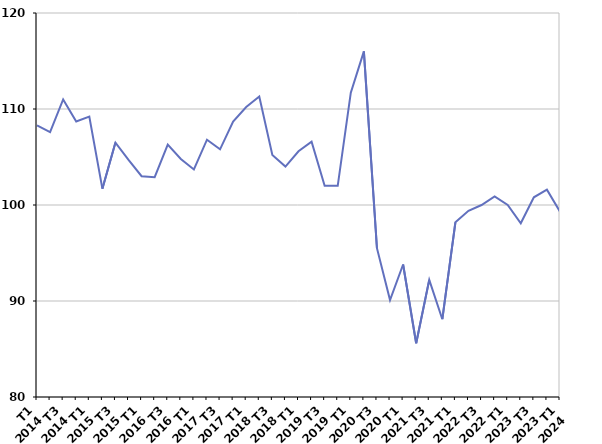
| Category | Fin de contrat |
|---|---|
| T1
2014 | 108.3 |
| T2
2014 | 107.6 |
| T3
2014 | 111 |
| T4
2014 | 108.7 |
| T1
2015 | 109.2 |
| T2
2015 | 101.7 |
| T3
2015 | 106.5 |
| T4
2015 | 104.7 |
| T1
2016 | 103 |
| T2
2016 | 102.9 |
| T3
2016 | 106.3 |
| T4
2016 | 104.8 |
| T1
2017 | 103.7 |
| T2
2017 | 106.8 |
| T3
2017 | 105.8 |
| T4
2017 | 108.7 |
| T1
2018 | 110.2 |
| T2
2018 | 111.3 |
| T3
2018 | 105.2 |
| T4
2018 | 104 |
| T1
2019 | 105.6 |
| T2
2019 | 106.6 |
| T3
2019 | 102 |
| T4
2019 | 102 |
| T1
2020 | 111.7 |
| T2
2020 | 116 |
| T3
2020 | 95.5 |
| T4
2020 | 90.1 |
| T1
2021 | 93.8 |
| T2
2021 | 85.6 |
| T3
2021 | 92.2 |
| T4
2021 | 88.1 |
| T1
2022 | 98.2 |
| T2
2022 | 99.4 |
| T3
2022 | 100 |
| T4
2022 | 100.9 |
| T1
2023 | 100 |
| T2
2023 | 98.1 |
| T3
2023 | 100.8 |
| T4
2023 | 101.6 |
| T1
2024 | 99.3 |